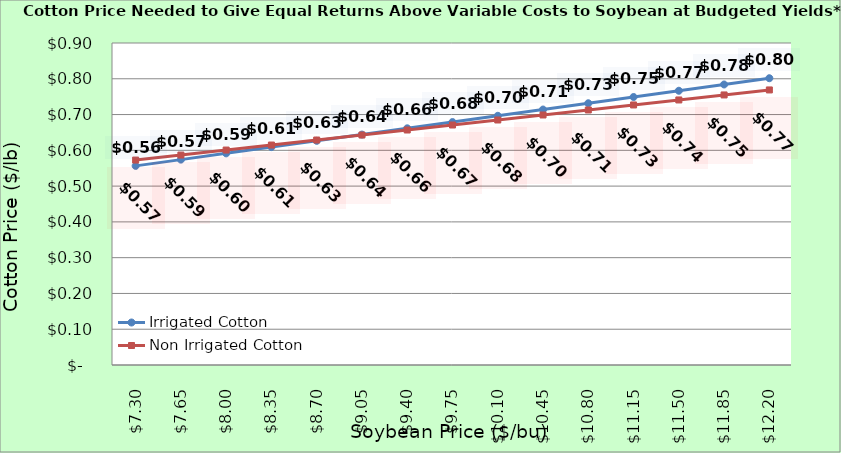
| Category | Irrigated Cotton | Non Irrigated Cotton |
|---|---|---|
| 7.3000000000000025 | 0.557 | 0.573 |
| 7.650000000000002 | 0.574 | 0.587 |
| 8.000000000000002 | 0.592 | 0.601 |
| 8.350000000000001 | 0.609 | 0.615 |
| 8.700000000000001 | 0.627 | 0.629 |
| 9.05 | 0.644 | 0.643 |
| 9.4 | 0.662 | 0.657 |
| 9.75 | 0.679 | 0.671 |
| 10.1 | 0.697 | 0.685 |
| 10.45 | 0.714 | 0.699 |
| 10.799999999999999 | 0.732 | 0.713 |
| 11.149999999999999 | 0.749 | 0.727 |
| 11.499999999999998 | 0.767 | 0.741 |
| 11.849999999999998 | 0.784 | 0.755 |
| 12.199999999999998 | 0.802 | 0.769 |